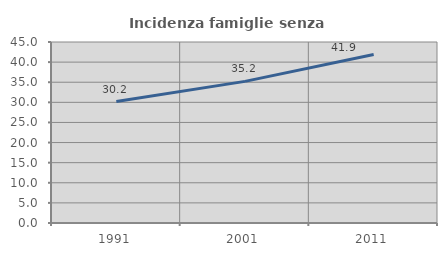
| Category | Incidenza famiglie senza nuclei |
|---|---|
| 1991.0 | 30.184 |
| 2001.0 | 35.209 |
| 2011.0 | 41.915 |